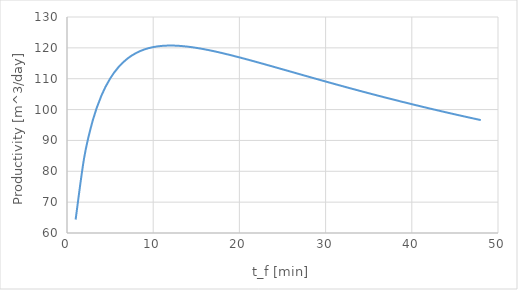
| Category | Productivity |
|---|---|
| 1.0 | 64.351 |
| 2.0 | 84.506 |
| 3.0 | 96.598 |
| 4.0 | 104.571 |
| 5.0 | 110.036 |
| 6.0 | 113.842 |
| 7.0 | 116.492 |
| 8.0 | 118.308 |
| 9.0 | 119.509 |
| 10.0 | 120.248 |
| 11.0 | 120.633 |
| 12.0 | 120.748 |
| 13.0 | 120.651 |
| 14.0 | 120.39 |
| 15.0 | 120 |
| 16.0 | 119.509 |
| 17.0 | 118.939 |
| 18.0 | 118.308 |
| 19.0 | 117.629 |
| 20.0 | 116.913 |
| 21.0 | 116.17 |
| 22.0 | 115.407 |
| 23.0 | 114.629 |
| 24.0 | 113.842 |
| 25.0 | 113.049 |
| 26.0 | 112.254 |
| 27.0 | 111.459 |
| 28.0 | 110.667 |
| 29.0 | 109.879 |
| 30.0 | 109.096 |
| 31.0 | 108.321 |
| 32.0 | 107.553 |
| 33.0 | 106.793 |
| 34.0 | 106.043 |
| 35.0 | 105.302 |
| 36.0 | 104.571 |
| 37.0 | 103.849 |
| 38.0 | 103.139 |
| 39.0 | 102.438 |
| 40.0 | 101.748 |
| 41.0 | 101.068 |
| 42.0 | 100.399 |
| 43.0 | 99.74 |
| 44.0 | 99.092 |
| 45.0 | 98.453 |
| 46.0 | 97.825 |
| 47.0 | 97.207 |
| 48.0 | 96.598 |